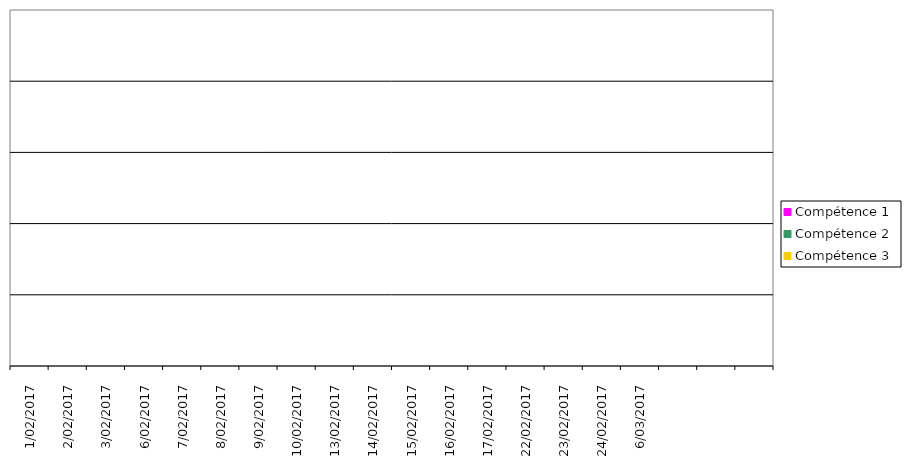
| Category | Compétence 1 | Compétence 2 | Compétence 3 |
|---|---|---|---|
| 1/02/2017 | 0 | 0 | 0 |
| 2/02/2017 | 0 | 0 | 0 |
| 3/02/2017 | 0 | 0 | 0 |
| 6/02/2017 | 0 | 0 | 0 |
| 7/02/2017 | 0 | 0 | 0 |
| 8/02/2017 | 0 | 0 | 0 |
| 9/02/2017 | 0 | 0 | 0 |
| 10/02/2017 | 0 | 0 | 0 |
| 13/02/2017 | 0 | 0 | 0 |
| 14/02/2017 | 0 | 0 | 0 |
| 15/02/2017 | 0 | 0 | 0 |
| 16/02/2017 | 0 | 0 | 0 |
| 17/02/2017 | 0 | 0 | 0 |
| 22/02/2017 | 0 | 0 | 0 |
| 23/02/2017 | 0 | 0 | 0 |
| 24/02/2017 | 0 | 0 | 0 |
| 6/03/2017 | 0 | 0 | 0 |